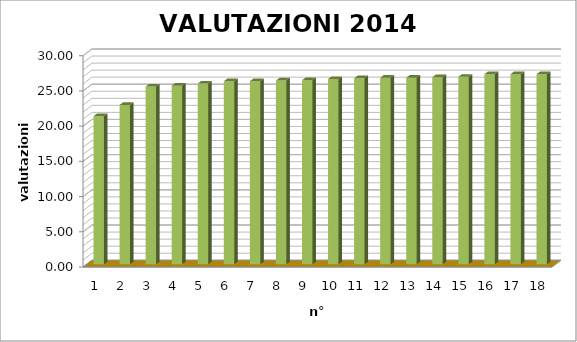
| Category | Series 0 |
|---|---|
| 0 | 21.04 |
| 1 | 22.64 |
| 2 | 25.24 |
| 3 | 25.37 |
| 4 | 25.67 |
| 5 | 26 |
| 6 | 26.01 |
| 7 | 26.1 |
| 8 | 26.14 |
| 9 | 26.31 |
| 10 | 26.42 |
| 11 | 26.49 |
| 12 | 26.49 |
| 13 | 26.56 |
| 14 | 26.63 |
| 15 | 27 |
| 16 | 27 |
| 17 | 27 |